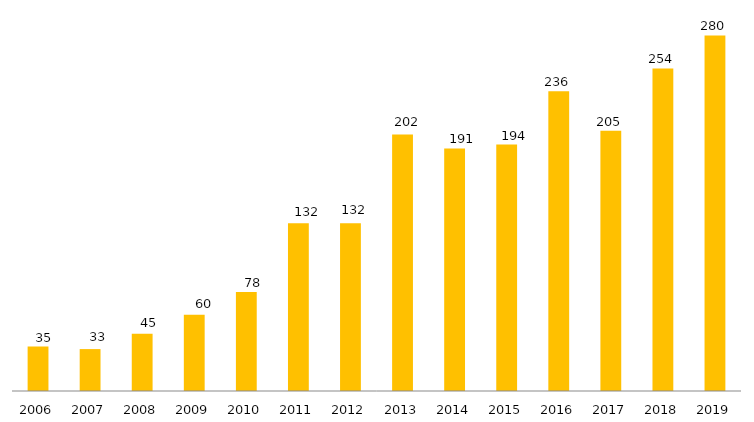
| Category | Programa |
|---|---|
| 2006.0 | 35 |
| 2007.0 | 33 |
| 2008.0 | 45 |
| 2009.0 | 60 |
| 2010.0 | 78 |
| 2011.0 | 132 |
| 2012.0 | 132 |
| 2013.0 | 202 |
| 2014.0 | 191 |
| 2015.0 | 194 |
| 2016.0 | 236 |
| 2017.0 | 205 |
| 2018.0 | 254 |
| 2019.0 | 280 |